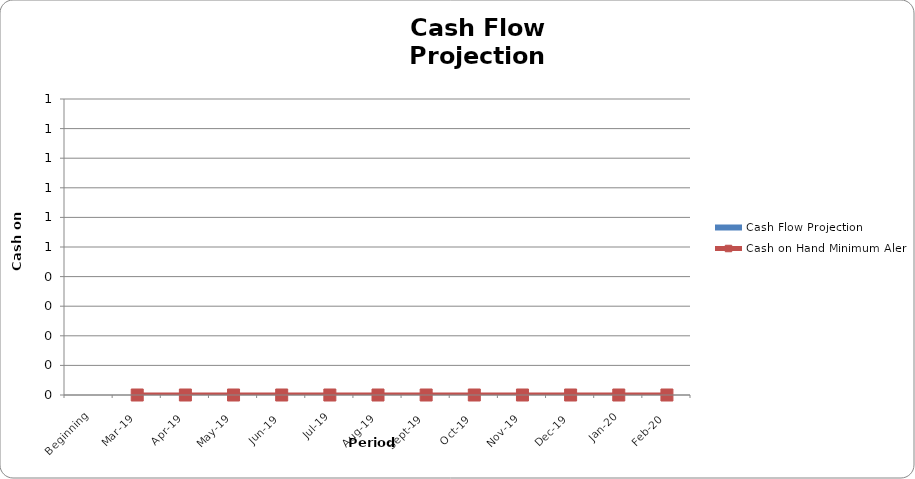
| Category | Cash Flow Projection |
|---|---|
| Beginning | 0 |
| Mar-19 | 0 |
| Apr-19 | 0 |
| May-19 | 0 |
| Jun-19 | 0 |
| Jul-19 | 0 |
| Aug-19 | 0 |
| Sep-19 | 0 |
| Oct-19 | 0 |
| Nov-19 | 0 |
| Dec-19 | 0 |
| Jan-20 | 0 |
| Feb-20 | 0 |